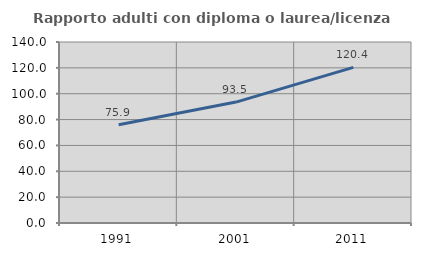
| Category | Rapporto adulti con diploma o laurea/licenza media  |
|---|---|
| 1991.0 | 75.943 |
| 2001.0 | 93.54 |
| 2011.0 | 120.365 |